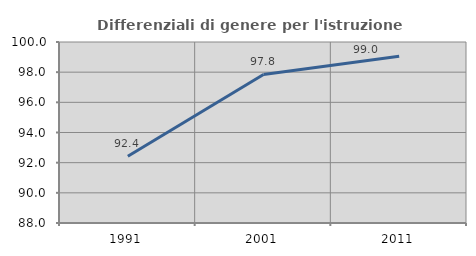
| Category | Differenziali di genere per l'istruzione superiore |
|---|---|
| 1991.0 | 92.423 |
| 2001.0 | 97.846 |
| 2011.0 | 99.05 |